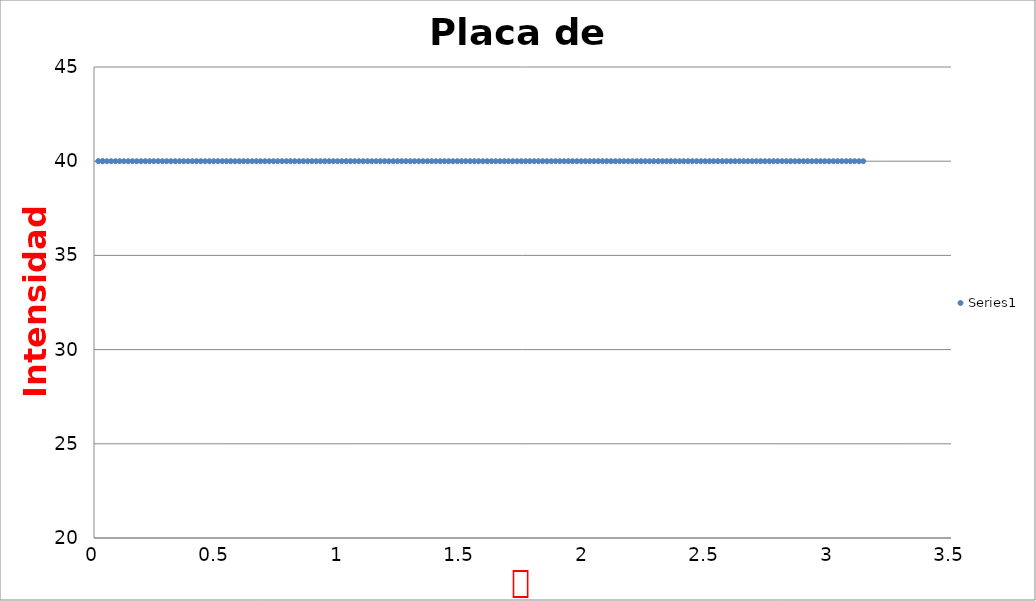
| Category | Series 0 |
|---|---|
| 0.017453292519943295 | 40 |
| 0.03490658503988659 | 40 |
| 0.03490658503988659 | 40 |
| 0.05235987755982988 | 40 |
| 0.06981317007977318 | 40 |
| 0.08726646259971647 | 40 |
| 0.10471975511965977 | 40 |
| 0.12217304763960307 | 40 |
| 0.13962634015954636 | 40 |
| 0.15707963267948966 | 40 |
| 0.17453292519943295 | 40 |
| 0.19198621771937624 | 40 |
| 0.20943951023931953 | 40 |
| 0.22689280275926285 | 40 |
| 0.24434609527920614 | 40 |
| 0.2617993877991494 | 40 |
| 0.2792526803190927 | 40 |
| 0.29670597283903605 | 40 |
| 0.3141592653589793 | 40 |
| 0.3316125578789226 | 40 |
| 0.3490658503988659 | 40 |
| 0.3665191429188092 | 40 |
| 0.3839724354387525 | 40 |
| 0.40142572795869574 | 40 |
| 0.41887902047863906 | 40 |
| 0.4363323129985824 | 40 |
| 0.4537856055185257 | 40 |
| 0.47123889803846897 | 40 |
| 0.4886921905584123 | 40 |
| 0.5061454830783556 | 40 |
| 0.5235987755982988 | 40 |
| 0.5410520681182421 | 40 |
| 0.5585053606381855 | 40 |
| 0.5759586531581288 | 40 |
| 0.5934119456780721 | 40 |
| 0.6108652381980153 | 40 |
| 0.6283185307179586 | 40 |
| 0.6457718232379019 | 40 |
| 0.6632251157578452 | 40 |
| 0.6806784082777885 | 40 |
| 0.6981317007977318 | 40 |
| 0.715584993317675 | 40 |
| 0.7330382858376184 | 40 |
| 0.7504915783575616 | 40 |
| 0.767944870877505 | 40 |
| 0.7853981633974483 | 40 |
| 0.8028514559173915 | 40 |
| 0.8203047484373349 | 40 |
| 0.8377580409572781 | 40 |
| 0.8552113334772214 | 40 |
| 0.8726646259971648 | 40 |
| 0.890117918517108 | 40 |
| 0.9075712110370514 | 40 |
| 0.9250245035569946 | 40 |
| 0.9424777960769379 | 40 |
| 0.9599310885968813 | 40 |
| 0.9773843811168246 | 40 |
| 0.9948376736367678 | 40 |
| 1.0122909661567112 | 40 |
| 1.0297442586766543 | 40 |
| 1.0471975511965976 | 40 |
| 1.064650843716541 | 40 |
| 1.0821041362364843 | 40 |
| 1.0995574287564276 | 40 |
| 1.117010721276371 | 40 |
| 1.1344640137963142 | 40 |
| 1.1519173063162575 | 40 |
| 1.1693705988362006 | 40 |
| 1.1868238913561442 | 40 |
| 1.2042771838760873 | 40 |
| 1.2217304763960306 | 40 |
| 1.239183768915974 | 40 |
| 1.2566370614359172 | 40 |
| 1.2740903539558606 | 40 |
| 1.2915436464758039 | 40 |
| 1.3089969389957472 | 40 |
| 1.3264502315156903 | 40 |
| 1.3439035240356338 | 40 |
| 1.361356816555577 | 40 |
| 1.3788101090755203 | 40 |
| 1.3962634015954636 | 40 |
| 1.413716694115407 | 40 |
| 1.43116998663535 | 40 |
| 1.4486232791552935 | 40 |
| 1.4660765716752369 | 40 |
| 1.4835298641951802 | 40 |
| 1.5009831567151233 | 40 |
| 1.5184364492350666 | 40 |
| 1.53588974175501 | 40 |
| 1.5533430342749535 | 40 |
| 1.5707963267948966 | 40 |
| 1.5882496193148399 | 40 |
| 1.605702911834783 | 40 |
| 1.6231562043547263 | 40 |
| 1.6406094968746698 | 40 |
| 1.6580627893946132 | 40 |
| 1.6755160819145563 | 40 |
| 1.6929693744344996 | 40 |
| 1.710422666954443 | 40 |
| 1.7278759594743864 | 40 |
| 1.7453292519943295 | 40 |
| 1.7627825445142729 | 40 |
| 1.780235837034216 | 40 |
| 1.7976891295541593 | 40 |
| 1.8151424220741028 | 40 |
| 1.8325957145940461 | 40 |
| 1.8500490071139892 | 40 |
| 1.8675022996339325 | 40 |
| 1.8849555921538759 | 40 |
| 1.902408884673819 | 40 |
| 1.9198621771937625 | 40 |
| 1.9373154697137058 | 40 |
| 1.9547687622336491 | 40 |
| 1.9722220547535922 | 40 |
| 1.9896753472735356 | 40 |
| 2.007128639793479 | 40 |
| 2.0245819323134224 | 40 |
| 2.0420352248333655 | 40 |
| 2.0594885173533086 | 40 |
| 2.076941809873252 | 40 |
| 2.0943951023931953 | 40 |
| 2.111848394913139 | 40 |
| 2.129301687433082 | 40 |
| 2.1467549799530254 | 40 |
| 2.1642082724729685 | 40 |
| 2.1816615649929116 | 40 |
| 2.199114857512855 | 40 |
| 2.2165681500327987 | 40 |
| 2.234021442552742 | 40 |
| 2.251474735072685 | 40 |
| 2.2689280275926285 | 40 |
| 2.286381320112572 | 40 |
| 2.303834612632515 | 40 |
| 2.321287905152458 | 40 |
| 2.3387411976724013 | 40 |
| 2.356194490192345 | 40 |
| 2.3736477827122884 | 40 |
| 2.3911010752322315 | 40 |
| 2.4085543677521746 | 40 |
| 2.426007660272118 | 40 |
| 2.443460952792061 | 40 |
| 2.4609142453120043 | 40 |
| 2.478367537831948 | 40 |
| 2.4958208303518914 | 40 |
| 2.5132741228718345 | 40 |
| 2.5307274153917776 | 40 |
| 2.548180707911721 | 40 |
| 2.5656340004316647 | 40 |
| 2.5830872929516078 | 40 |
| 2.600540585471551 | 40 |
| 2.6179938779914944 | 40 |
| 2.6354471705114375 | 40 |
| 2.6529004630313806 | 40 |
| 2.670353755551324 | 40 |
| 2.6878070480712677 | 40 |
| 2.705260340591211 | 40 |
| 2.722713633111154 | 40 |
| 2.740166925631097 | 40 |
| 2.7576202181510405 | 40 |
| 2.775073510670984 | 40 |
| 2.792526803190927 | 40 |
| 2.8099800957108703 | 40 |
| 2.827433388230814 | 40 |
| 2.844886680750757 | 40 |
| 2.8623399732707 | 40 |
| 2.8797932657906435 | 40 |
| 2.897246558310587 | 40 |
| 2.9146998508305306 | 40 |
| 2.9321531433504737 | 40 |
| 2.949606435870417 | 40 |
| 2.9670597283903604 | 40 |
| 2.9845130209103035 | 40 |
| 3.0019663134302466 | 40 |
| 3.01941960595019 | 40 |
| 3.036872898470133 | 40 |
| 3.0543261909900763 | 40 |
| 3.07177948351002 | 40 |
| 3.0892327760299634 | 40 |
| 3.106686068549907 | 40 |
| 3.12413936106985 | 40 |
| 3.141592653589793 | 40 |